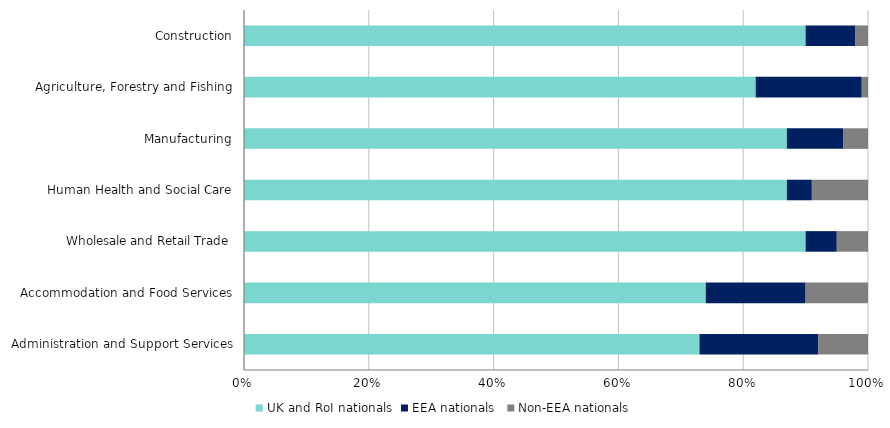
| Category | UK and RoI nationals | EEA nationals  | Non-EEA nationals |
|---|---|---|---|
| Administration and Support Services | 0.73 | 0.19 | 0.08 |
| Accommodation and Food Services | 0.74 | 0.16 | 0.1 |
| Wholesale and Retail Trade | 0.9 | 0.05 | 0.05 |
| Human Health and Social Care | 0.87 | 0.04 | 0.09 |
| Manufacturing | 0.87 | 0.09 | 0.04 |
| Agriculture, Forestry and Fishing | 0.82 | 0.17 | 0.01 |
| Construction | 0.9 | 0.08 | 0.02 |